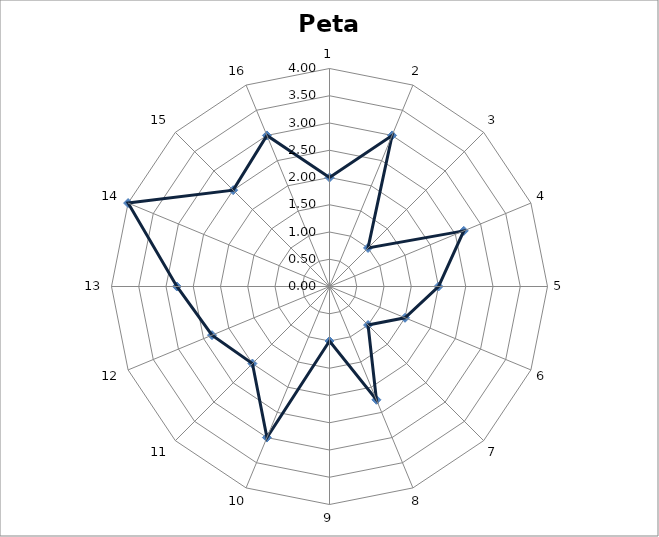
| Category | Series 0 |
|---|---|
| 0 | 2 |
| 1 | 3 |
| 2 | 1 |
| 3 | 2.667 |
| 4 | 2 |
| 5 | 1.5 |
| 6 | 1 |
| 7 | 2.25 |
| 8 | 1 |
| 9 | 3 |
| 10 | 2 |
| 11 | 2.333 |
| 12 | 2.8 |
| 13 | 4 |
| 14 | 2.5 |
| 15 | 3 |